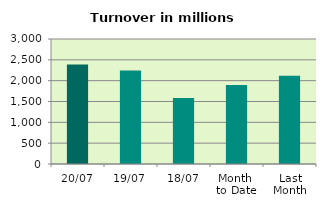
| Category | Series 0 |
|---|---|
| 20/07 | 2385.818 |
| 19/07 | 2246.176 |
| 18/07 | 1583.14 |
| Month 
to Date | 1897.972 |
| Last
Month | 2115.436 |